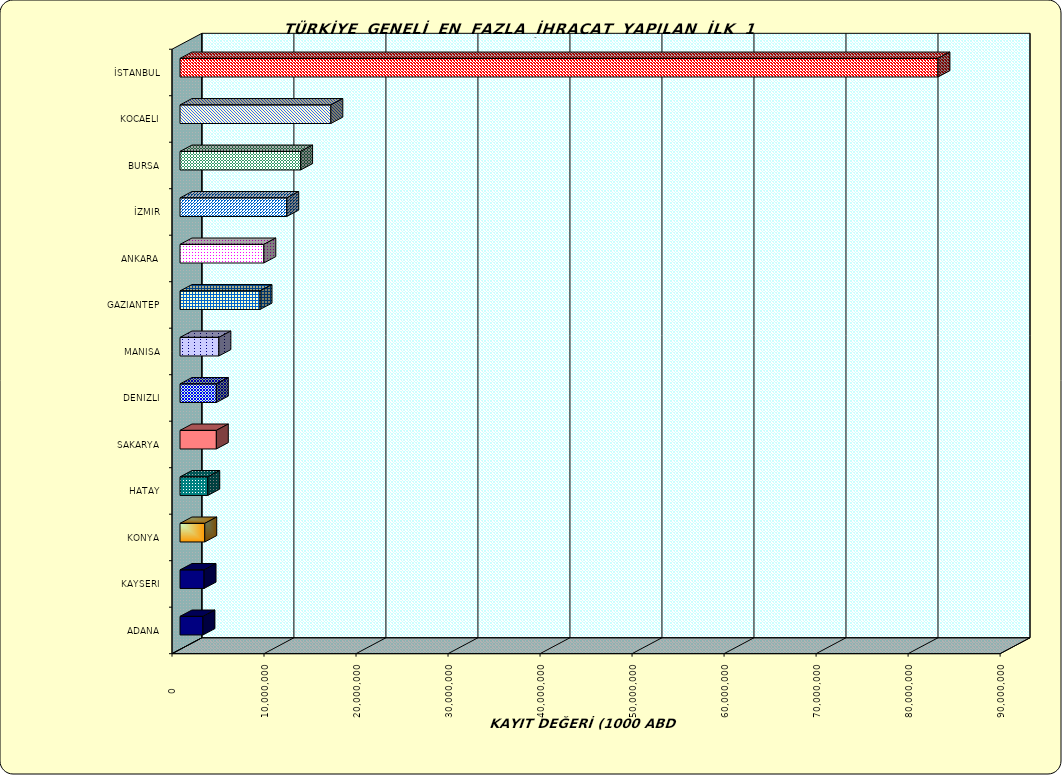
| Category | Series 0 |
|---|---|
| İSTANBUL | 82373767.174 |
| KOCAELI | 16392050.009 |
| BURSA | 13105628.295 |
| İZMIR | 11600554.932 |
| ANKARA | 9108577.428 |
| GAZIANTEP | 8696490.051 |
| MANISA | 4222816.423 |
| DENIZLI | 3951607.464 |
| SAKARYA | 3947913.962 |
| HATAY | 3015099.28 |
| KONYA | 2689433.276 |
| KAYSERI | 2613619.816 |
| ADANA | 2490890.755 |